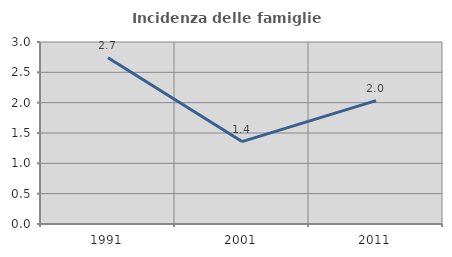
| Category | Incidenza delle famiglie numerose |
|---|---|
| 1991.0 | 2.74 |
| 2001.0 | 1.359 |
| 2011.0 | 2.034 |